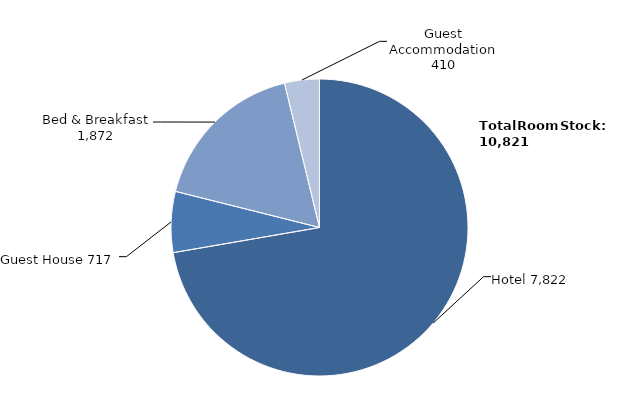
| Category | Series 0 |
|---|---|
| Hotel | 7822 |
| Guest House | 717 |
| Bed & Breakfast | 1872 |
| Guest Accommodation | 410 |